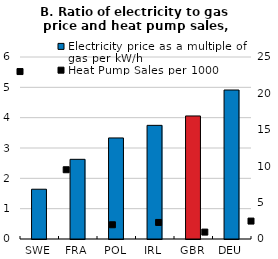
| Category | Electricity price as a multiple of gas per kW/h |
|---|---|
| SWE | 1.641 |
| FRA | 2.627 |
| POL | 3.331 |
| IRL | 3.747 |
| GBR | 4.056 |
| DEU | 4.912 |